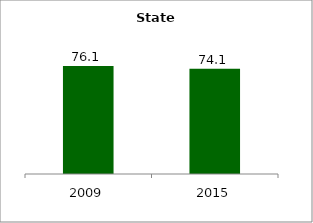
| Category | State |
|---|---|
| 2009.0 | 76.127 |
| 2015.0 | 74.095 |